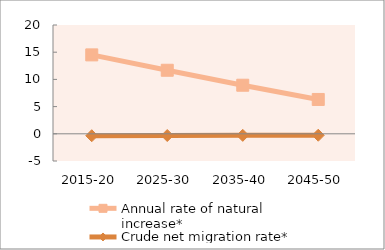
| Category | Annual rate of natural increase* | Crude net migration rate* |
|---|---|---|
| 2015-20 | 14.508 | -0.357 |
| 2025-30 | 11.681 | -0.314 |
| 2035-40 | 8.928 | -0.284 |
| 2045-50 | 6.311 | -0.264 |